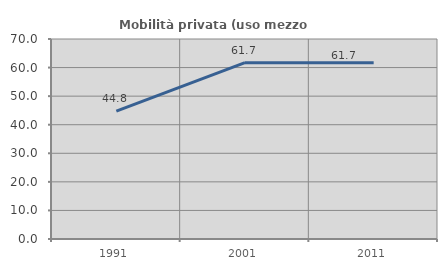
| Category | Mobilità privata (uso mezzo privato) |
|---|---|
| 1991.0 | 44.767 |
| 2001.0 | 61.702 |
| 2011.0 | 61.702 |